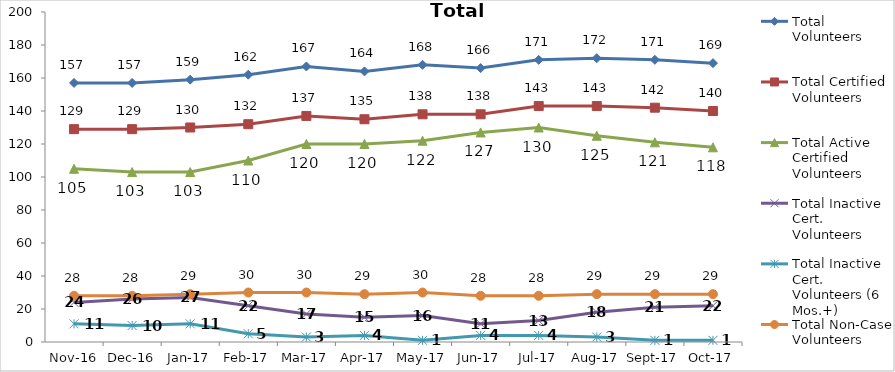
| Category | Total Volunteers | Total Certified Volunteers | Total Active Certified Volunteers | Total Inactive Cert. Volunteers | Total Inactive Cert. Volunteers (6 Mos.+) | Total Non-Case Volunteers |
|---|---|---|---|---|---|---|
| 2016-11-01 | 157 | 129 | 105 | 24 | 11 | 28 |
| 2016-12-01 | 157 | 129 | 103 | 26 | 10 | 28 |
| 2017-01-01 | 159 | 130 | 103 | 27 | 11 | 29 |
| 2017-02-01 | 162 | 132 | 110 | 22 | 5 | 30 |
| 2017-03-01 | 167 | 137 | 120 | 17 | 3 | 30 |
| 2017-04-01 | 164 | 135 | 120 | 15 | 4 | 29 |
| 2017-05-01 | 168 | 138 | 122 | 16 | 1 | 30 |
| 2017-06-01 | 166 | 138 | 127 | 11 | 4 | 28 |
| 2017-07-01 | 171 | 143 | 130 | 13 | 4 | 28 |
| 2017-08-01 | 172 | 143 | 125 | 18 | 3 | 29 |
| 2017-09-01 | 171 | 142 | 121 | 21 | 1 | 29 |
| 2017-10-01 | 169 | 140 | 118 | 22 | 1 | 29 |